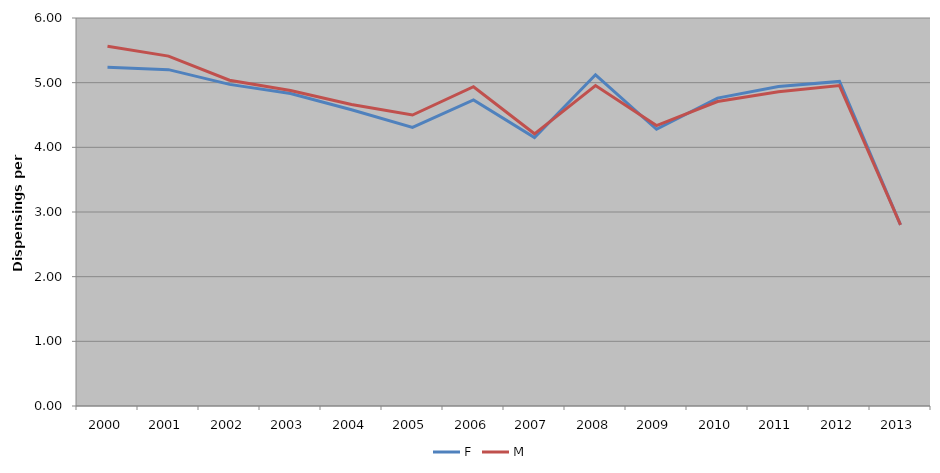
| Category | F | M |
|---|---|---|
| 2000 | 5.239 | 5.562 |
| 2001 | 5.201 | 5.411 |
| 2002 | 4.974 | 5.038 |
| 2003 | 4.833 | 4.88 |
| 2004 | 4.582 | 4.662 |
| 2005 | 4.309 | 4.5 |
| 2006 | 4.733 | 4.937 |
| 2007 | 4.15 | 4.209 |
| 2008 | 5.121 | 4.955 |
| 2009 | 4.279 | 4.336 |
| 2010 | 4.761 | 4.708 |
| 2011 | 4.94 | 4.861 |
| 2012 | 5.02 | 4.955 |
| 2013 | 2.802 | 2.8 |